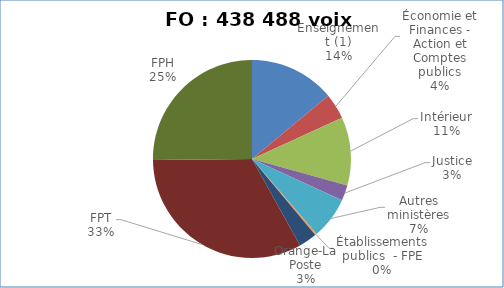
| Category | Nombre de voix |
|---|---|
| Enseignement (1) | 61299 |
| Économie et Finances - Action et Comptes publics | 18292 |
| Intérieur | 48963 |
| Justice | 11049 |
| Autres ministères | 29910.5 |
| Établissements publics  - FPE | 1319 |
| Orange-La Poste | 13016 |
| FPT | 144393 |
| FPH | 110246 |